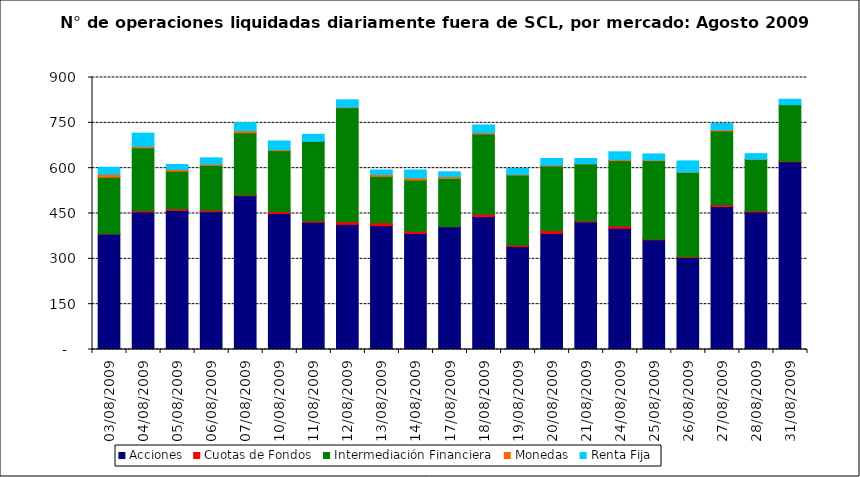
| Category | Acciones | Cuotas de Fondos | Intermediación Financiera | Monedas | Renta Fija |
|---|---|---|---|---|---|
| 03/08/2009 | 382 | 1 | 187 | 10 | 23 |
| 04/08/2009 | 455 | 4 | 208 | 5 | 44 |
| 05/08/2009 | 460 | 5 | 125 | 6 | 16 |
| 06/08/2009 | 456 | 5 | 148 | 4 | 21 |
| 07/08/2009 | 509 | 2 | 206 | 7 | 27 |
| 10/08/2009 | 450 | 7 | 201 | 3 | 29 |
| 11/08/2009 | 421 | 4 | 264 | 0 | 23 |
| 12/08/2009 | 414 | 9 | 377 | 2 | 24 |
| 13/08/2009 | 410 | 9 | 154 | 6 | 15 |
| 14/08/2009 | 384 | 7 | 170 | 7 | 26 |
| 17/08/2009 | 406 | 1 | 159 | 6 | 16 |
| 18/08/2009 | 440 | 8 | 265 | 4 | 26 |
| 19/08/2009 | 341 | 5 | 231 | 2 | 20 |
| 20/08/2009 | 384 | 10 | 213 | 3 | 22 |
| 21/08/2009 | 422 | 3 | 189 | 1 | 17 |
| 24/08/2009 | 401 | 8 | 216 | 3 | 26 |
| 25/08/2009 | 363 | 2 | 260 | 2 | 20 |
| 26/08/2009 | 304 | 3 | 279 | 1 | 37 |
| 27/08/2009 | 473 | 6 | 244 | 4 | 21 |
| 28/08/2009 | 455 | 3 | 171 | 1 | 18 |
| 31/08/2009 | 621 | 2 | 187 | 0 | 18 |